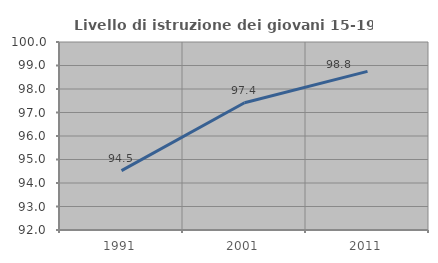
| Category | Livello di istruzione dei giovani 15-19 anni |
|---|---|
| 1991.0 | 94.529 |
| 2001.0 | 97.414 |
| 2011.0 | 98.75 |